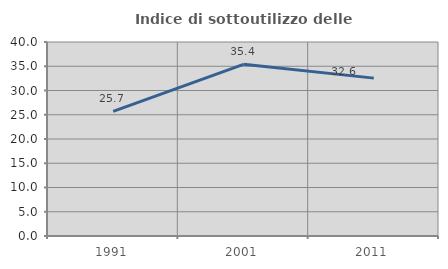
| Category | Indice di sottoutilizzo delle abitazioni  |
|---|---|
| 1991.0 | 25.688 |
| 2001.0 | 35.393 |
| 2011.0 | 32.552 |